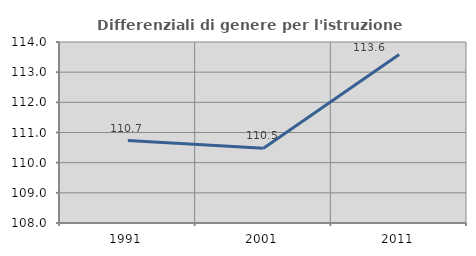
| Category | Differenziali di genere per l'istruzione superiore |
|---|---|
| 1991.0 | 110.734 |
| 2001.0 | 110.48 |
| 2011.0 | 113.589 |